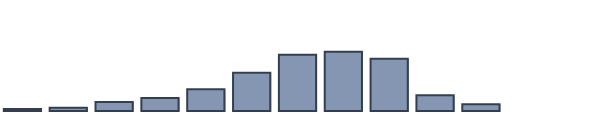
| Category | Series 0 |
|---|---|
| 0 | 0.758 |
| 1 | 1.136 |
| 2 | 3.258 |
| 3 | 4.697 |
| 4 | 7.803 |
| 5 | 13.788 |
| 6 | 20.227 |
| 7 | 21.364 |
| 8 | 18.864 |
| 9 | 5.682 |
| 10 | 2.424 |
| 11 | 0 |
| 12 | 0 |